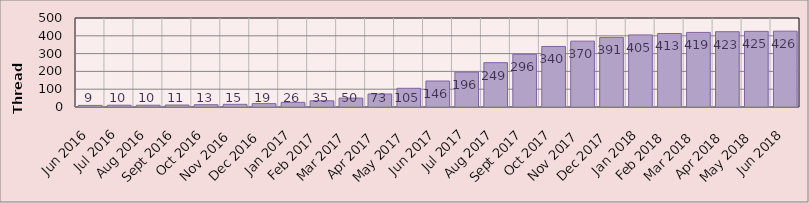
| Category | Series 3 |
|---|---|
| 2016-06-01 | 9 |
| 2016-07-01 | 10 |
| 2016-08-01 | 10 |
| 2016-09-01 | 11 |
| 2016-10-01 | 13 |
| 2016-11-01 | 15 |
| 2016-12-01 | 19 |
| 2017-01-01 | 26 |
| 2017-02-01 | 35 |
| 2017-03-01 | 50 |
| 2017-04-01 | 73 |
| 2017-05-01 | 105 |
| 2017-06-01 | 146 |
| 2017-07-01 | 196 |
| 2017-08-01 | 249 |
| 2017-09-01 | 296 |
| 2017-10-01 | 340 |
| 2017-11-01 | 370 |
| 2017-12-01 | 391 |
| 2018-01-01 | 405 |
| 2018-02-01 | 413 |
| 2018-03-01 | 419 |
| 2018-04-01 | 423 |
| 2018-05-01 | 425 |
| 2018-06-01 | 426 |